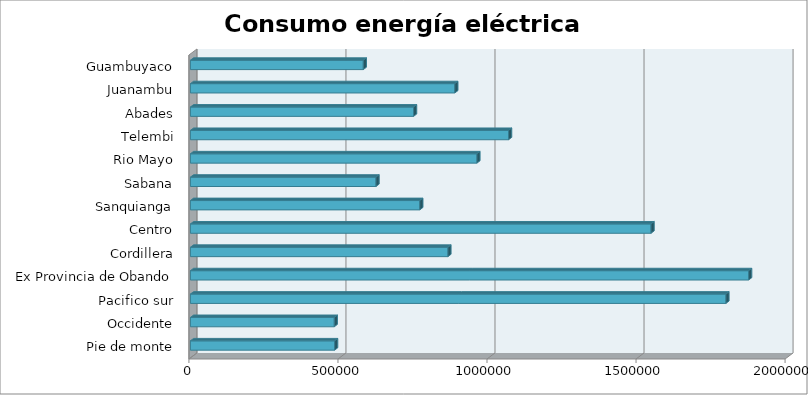
| Category | Series 0 |
|---|---|
| Pie de monte | 483827.437 |
| Occidente | 482615.131 |
| Pacifico sur | 1796617.864 |
| Ex Provincia de Obando | 1872881.983 |
| Cordillera | 863905.708 |
| Centro | 1545358.698 |
| Sanquianga | 769480.407 |
| Sabana | 622566.807 |
| Rio Mayo | 961222.978 |
| Telembi | 1067440.57 |
| Abades | 748692.92 |
| Juanambu | 886965.676 |
| Guambuyaco | 580052.173 |